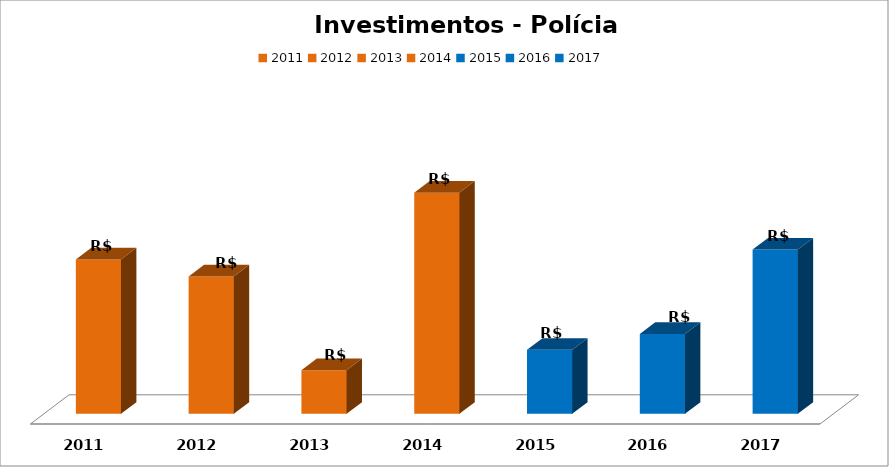
| Category | Series 1 |
|---|---|
| 2011.0 | 19670353.08 |
| 2012.0 | 17500757.85 |
| 2013.0 | 5566470.36 |
| 2014.0 | 28175403.18 |
| 2015.0 | 8153917.22 |
| 2016.0 | 10187132.57 |
| 2017.0 | 20940588.95 |